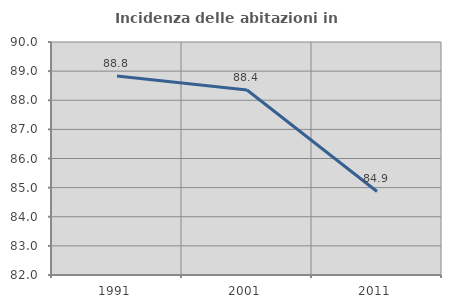
| Category | Incidenza delle abitazioni in proprietà  |
|---|---|
| 1991.0 | 88.831 |
| 2001.0 | 88.352 |
| 2011.0 | 84.868 |